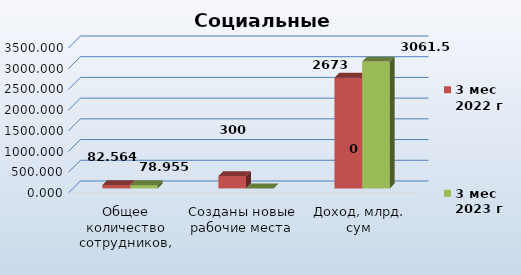
| Category | Series 0 | 3 мес
2022 г | 3 мес
2023 г |
|---|---|---|---|
| Общее количество сотрудников, тыс. человек |  | 82.564 | 78.955 |
| Созданы новые рабочие места |  | 300 | 0 |
| Доход, млрд. сум |  | 2673 | 3061.5 |